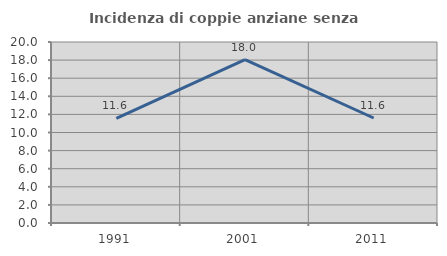
| Category | Incidenza di coppie anziane senza figli  |
|---|---|
| 1991.0 | 11.556 |
| 2001.0 | 18.049 |
| 2011.0 | 11.602 |